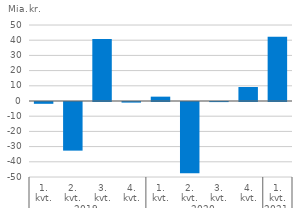
| Category | Nettotilgang |
|---|---|
| 0 | -1.19 |
| 1 | -31.99 |
| 2 | 40.78 |
| 3 | -0.39 |
| 4 | 2.86 |
| 5 | -46.94 |
| 6 | -0.06 |
| 7 | 9.2 |
| 8 | 42.34 |